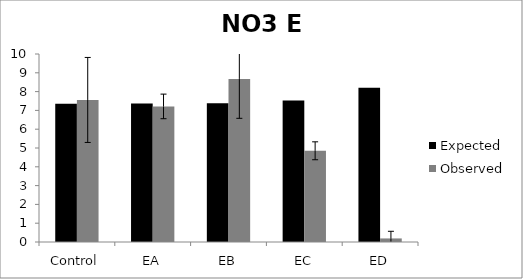
| Category | Expected | Observed |
|---|---|---|
| Control | 7.36 | 7.556 |
| EA | 7.362 | 7.212 |
| EB | 7.377 | 8.676 |
| EC | 7.528 | 4.852 |
| ED | 8.201 | 0.19 |